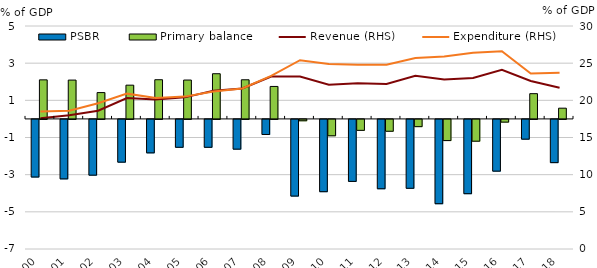
| Category | PSBR | Primary balance |
|---|---|---|
| 2000.0 | -3.1 | 2.102 |
| 2001.0 | -3.2 | 2.09 |
| 2002.0 | -3 | 1.417 |
| 2003.0 | -2.3 | 1.816 |
| 2004.0 | -1.8 | 2.109 |
| 2005.0 | -1.5 | 2.092 |
| 2006.0 | -1.5 | 2.432 |
| 2007.0 | -1.6 | 2.106 |
| 2008.0 | -0.81 | 1.747 |
| 2009.0 | -4.125 | -0.073 |
| 2010.0 | -3.889 | -0.881 |
| 2011.0 | -3.335 | -0.588 |
| 2012.0 | -3.731 | -0.637 |
| 2013.0 | -3.706 | -0.389 |
| 2014.0 | -4.536 | -1.139 |
| 2015.0 | -3.997 | -1.172 |
| 2016.0 | -2.784 | -0.145 |
| 2017.0 | -1.062 | 1.359 |
| 2018.0 | -2.325 | 0.577 |